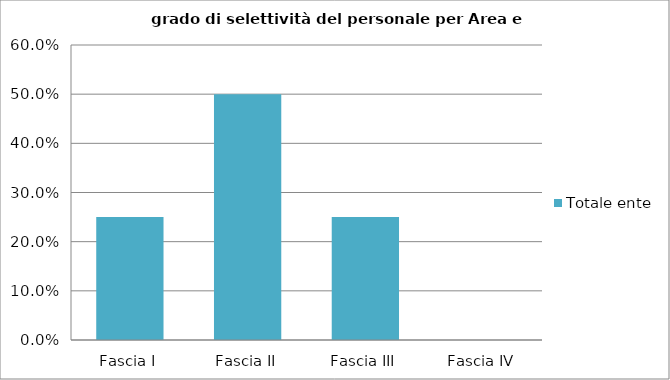
| Category | Totale ente |
|---|---|
| Fascia I | 0.25 |
| Fascia II | 0.5 |
| Fascia III | 0.25 |
| Fascia IV | 0 |